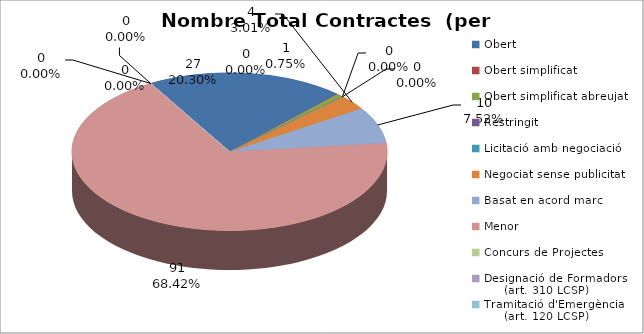
| Category | Nombre Total Contractes |
|---|---|
| Obert | 27 |
| Obert simplificat | 0 |
| Obert simplificat abreujat | 1 |
| Restringit | 0 |
| Licitació amb negociació | 0 |
| Negociat sense publicitat | 4 |
| Basat en acord marc | 10 |
| Menor | 91 |
| Concurs de Projectes | 0 |
| Designació de Formadors
     (art. 310 LCSP) | 0 |
| Tramitació d'Emergència
     (art. 120 LCSP) | 0 |